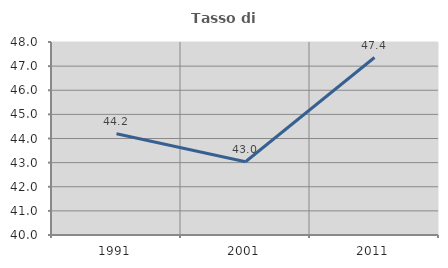
| Category | Tasso di occupazione   |
|---|---|
| 1991.0 | 44.196 |
| 2001.0 | 43.035 |
| 2011.0 | 47.357 |